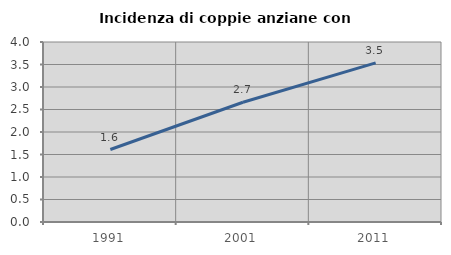
| Category | Incidenza di coppie anziane con figli |
|---|---|
| 1991.0 | 1.61 |
| 2001.0 | 2.661 |
| 2011.0 | 3.535 |